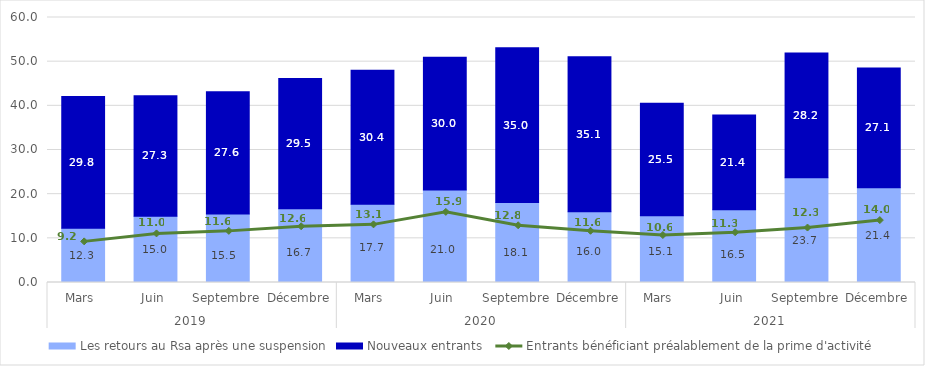
| Category | Les retours au Rsa après une suspension | Nouveaux entrants  |
|---|---|---|
| 0 | 12.3 | 29.8 |
| 1 | 15 | 27.3 |
| 2 | 15.531 | 27.648 |
| 3 | 16.682 | 29.504 |
| 4 | 17.701 | 30.358 |
| 5 | 20.965 | 30.019 |
| 6 | 18.137 | 35.041 |
| 7 | 16.02 | 35.109 |
| 8 | 15.102 | 25.499 |
| 9 | 16.493 | 21.411 |
| 10 | 23.72 | 28.237 |
| 11 | 21.435 | 27.133 |